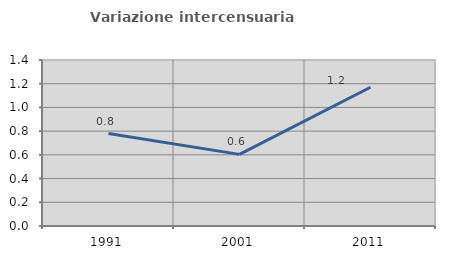
| Category | Variazione intercensuaria annua |
|---|---|
| 1991.0 | 0.78 |
| 2001.0 | 0.604 |
| 2011.0 | 1.17 |